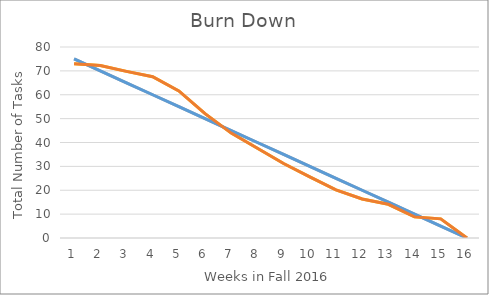
| Category | Series 2 | Series 3 | Series 0 | Series 1 |
|---|---|---|---|---|
| 0 | 75 | 73 | 75 | 73 |
| 1 | 70 | 72.233 | 70 | 72.233 |
| 2 | 65 | 69.795 | 65 | 69.795 |
| 3 | 60 | 67.557 | 60 | 67.557 |
| 4 | 55 | 61.586 | 55 | 61.586 |
| 5 | 50 | 52.064 | 50 | 52.064 |
| 6 | 45 | 43.943 | 45 | 43.943 |
| 7 | 40 | 37.571 | 40 | 37.571 |
| 8 | 35 | 31.2 | 35 | 31.2 |
| 9 | 30 | 25.629 | 30 | 25.629 |
| 10 | 25 | 20.157 | 25 | 20.157 |
| 11 | 20 | 16.336 | 20 | 16.336 |
| 12 | 15 | 14.114 | 15 | 14.114 |
| 13 | 10 | 8.843 | 10 | 8.843 |
| 14 | 5 | 8.021 | 5 | 8.021 |
| 15 | 0 | 0 | 0 | 0 |